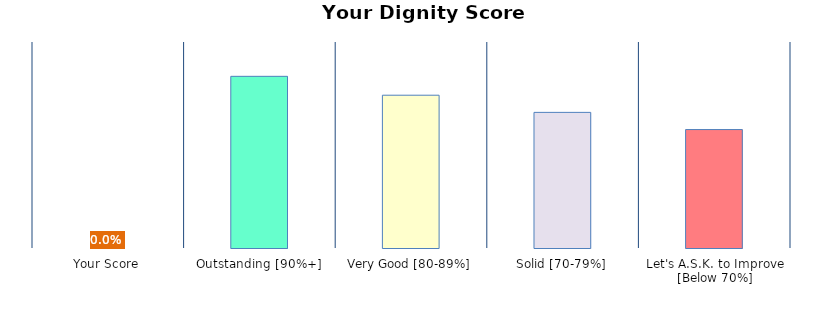
| Category | Series 0 |
|---|---|
| Your Score | 0 |
| Outstanding [90%+] | 1 |
| Very Good [80-89%] | 0.89 |
| Solid [70-79%] | 0.79 |
| Let's A.S.K. to Improve [Below 70%] | 0.69 |